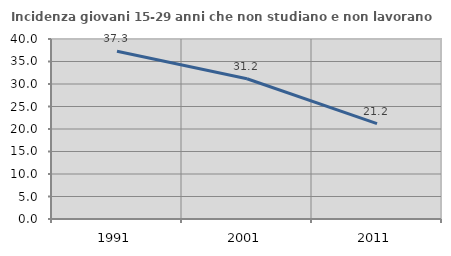
| Category | Incidenza giovani 15-29 anni che non studiano e non lavorano  |
|---|---|
| 1991.0 | 37.259 |
| 2001.0 | 31.169 |
| 2011.0 | 21.212 |